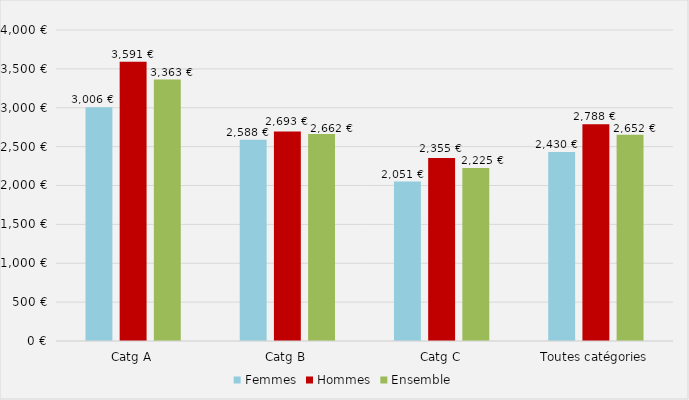
| Category | Femmes | Hommes | Ensemble |
|---|---|---|---|
| Catg A | 3005.84 | 3590.69 | 3363.08 |
| Catg B | 2587.67 | 2693.24 | 2661.76 |
| Catg C | 2050.98 | 2354.89 | 2224.57 |
| Toutes catégories | 2430.29 | 2788.17 | 2651.8 |